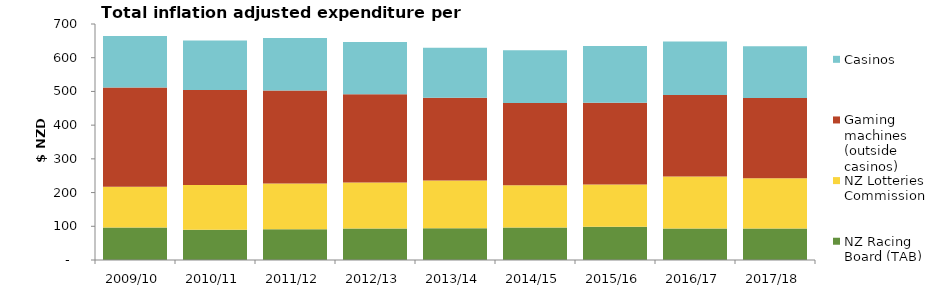
| Category | NZ Racing Board (TAB) | NZ Lotteries Commission | Gaming machines (outside casinos) | Casinos |
|---|---|---|---|---|
| 2009/10 | 96.661 | 120.351 | 294.839 | 152.702 |
| 2010/11 | 89.655 | 132.934 | 281.363 | 147.349 |
| 2011/12 | 91.426 | 135.301 | 275.927 | 155.956 |
| 2012/13 | 93.203 | 136.763 | 261.85 | 155.053 |
| 2013/14 | 94.506 | 141.09 | 245.663 | 147.975 |
| 2014/15 | 96.736 | 125.105 | 243.472 | 156.867 |
| 2015/16 | 98.365 | 125.657 | 242.394 | 168.291 |
| 2016/17 | 93.774 | 154.003 | 241.537 | 158.7 |
| 2017/18 | 93.114 | 149.202 | 238.18 | 153.803 |